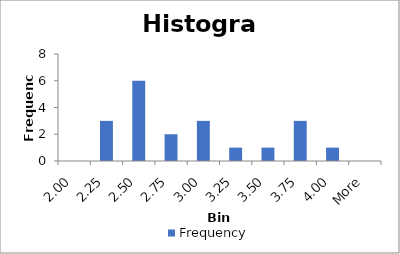
| Category | Frequency |
|---|---|
| 2.00 | 0 |
| 2.25 | 3 |
| 2.50 | 6 |
| 2.75 | 2 |
| 3.00 | 3 |
| 3.25 | 1 |
| 3.50 | 1 |
| 3.75 | 3 |
| 4.00 | 1 |
| More | 0 |